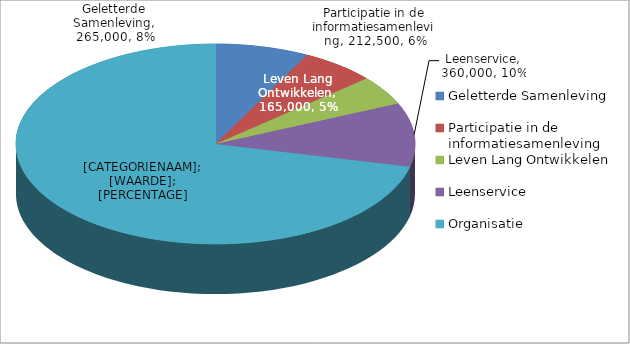
| Category | Series 0 |
|---|---|
| Geletterde Samenleving | 265000 |
| Participatie in de informatiesamenleving | 212500 |
| Leven Lang Ontwikkelen | 165000 |
| Leenservice | 360000 |
| Organisatie | 2495000 |